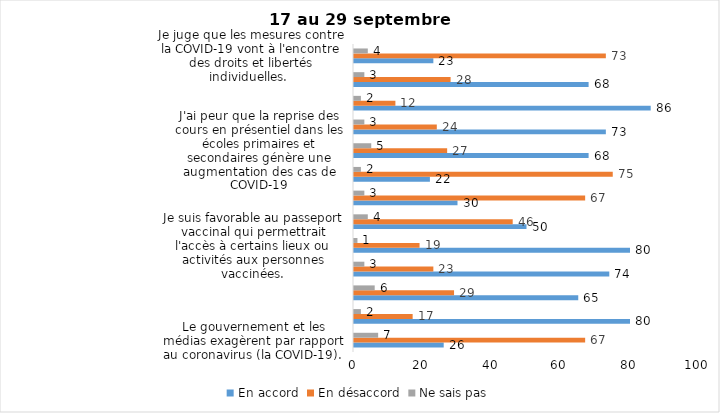
| Category | En accord | En désaccord | Ne sais pas |
|---|---|---|---|
| Le gouvernement et les médias exagèrent par rapport au coronavirus (la COVID-19). | 26 | 67 | 7 |
| J’ai peur que le système de santé soit débordé par les cas de COVID-19. | 80 | 17 | 2 |
| J’ai peur que la reprise des cours en présentiel dans les cégeps et les universités génère une augmentation des cas de COVID-19. | 65 | 29 | 6 |
| Je suis inquiet/inquiète  que le nombre de cas augmente en raison des nouveaux variants du virus de la COVID-19 | 74 | 23 | 3 |
| Je suis favorable au passeport vaccinal qui permettrait l'accès à certains lieux ou activités aux personnes vaccinées. | 80 | 19 | 1 |
| Si les cas de COVID-19 augmentent cet automne, je suis favorable à la mise en place de mesures de confinement (ex. fermeture de services non essentiels, interdiction des rassemblements privés) | 50 | 46 | 4 |
| Je suis favorable à ce que le port du masque ne soit plus obligatoire au Québec. | 30 | 67 | 3 |
| Étant donné la progression de la vaccination, je pense qu’il est moins important de suivre les mesures de prévention. | 22 | 75 | 2 |
| J'ai peur que la reprise des cours en présentiel dans les écoles primaires et secondaires génère une augmentation des cas de COVID-19 | 68 | 27 | 5 |
| Je suis favorable à ce qu’il y ait des sanctions aux commerçants qui ne vérifieront pas le passeport vaccinal (code QR) de leurs clients | 73 | 24 | 3 |
| Je suis favorable à ce qu’il y ait des sanctions aux gens qui tenteront de frauder leur passeport vaccinal par des amendes ou des accusations criminelles. | 86 | 12 | 2 |
| Je crois que le passeport vaccinal devrait être requis pour davantage de services et commerces (ex. : spas, centre d’achats, centre de soins personnels. | 68 | 28 | 3 |
| Je juge que les mesures contre la COVID-19 vont à l'encontre des droits et libertés individuelles.  | 23 | 73 | 4 |